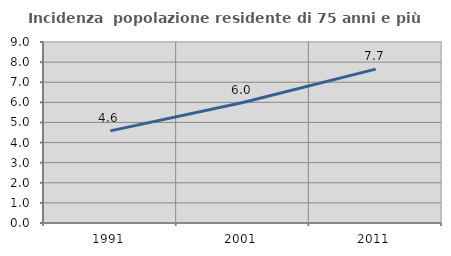
| Category | Incidenza  popolazione residente di 75 anni e più |
|---|---|
| 1991.0 | 4.582 |
| 2001.0 | 5.991 |
| 2011.0 | 7.65 |